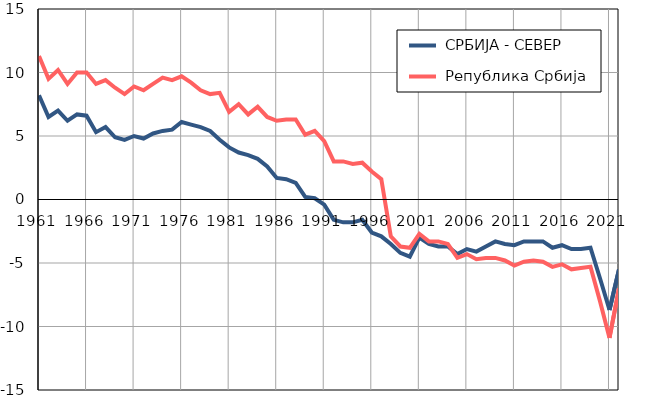
| Category |  СРБИЈА - СЕВЕР |  Република Србија |
|---|---|---|
| 1961.0 | 8.2 | 11.3 |
| 1962.0 | 6.5 | 9.5 |
| 1963.0 | 7 | 10.2 |
| 1964.0 | 6.2 | 9.1 |
| 1965.0 | 6.7 | 10 |
| 1966.0 | 6.6 | 10 |
| 1967.0 | 5.3 | 9.1 |
| 1968.0 | 5.7 | 9.4 |
| 1969.0 | 4.9 | 8.8 |
| 1970.0 | 4.7 | 8.3 |
| 1971.0 | 5 | 8.9 |
| 1972.0 | 4.8 | 8.6 |
| 1973.0 | 5.2 | 9.1 |
| 1974.0 | 5.4 | 9.6 |
| 1975.0 | 5.5 | 9.4 |
| 1976.0 | 6.1 | 9.7 |
| 1977.0 | 5.9 | 9.2 |
| 1978.0 | 5.7 | 8.6 |
| 1979.0 | 5.4 | 8.3 |
| 1980.0 | 4.7 | 8.4 |
| 1981.0 | 4.1 | 6.9 |
| 1982.0 | 3.7 | 7.5 |
| 1983.0 | 3.5 | 6.7 |
| 1984.0 | 3.2 | 7.3 |
| 1985.0 | 2.6 | 6.5 |
| 1986.0 | 1.7 | 6.2 |
| 1987.0 | 1.6 | 6.3 |
| 1988.0 | 1.3 | 6.3 |
| 1989.0 | 0.2 | 5.1 |
| 1990.0 | 0.1 | 5.4 |
| 1991.0 | -0.4 | 4.6 |
| 1992.0 | -1.6 | 3 |
| 1993.0 | -1.8 | 3 |
| 1994.0 | -1.8 | 2.8 |
| 1995.0 | -1.6 | 2.9 |
| 1996.0 | -2.6 | 2.2 |
| 1997.0 | -2.9 | 1.6 |
| 1998.0 | -3.5 | -2.9 |
| 1999.0 | -4.2 | -3.7 |
| 2000.0 | -4.5 | -3.8 |
| 2001.0 | -3 | -2.7 |
| 2002.0 | -3.5 | -3.3 |
| 2003.0 | -3.7 | -3.3 |
| 2004.0 | -3.7 | -3.5 |
| 2005.0 | -4.3 | -4.6 |
| 2006.0 | -3.9 | -4.3 |
| 2007.0 | -4.1 | -4.7 |
| 2008.0 | -3.7 | -4.6 |
| 2009.0 | -3.3 | -4.6 |
| 2010.0 | -3.5 | -4.8 |
| 2011.0 | -3.6 | -5.2 |
| 2012.0 | -3.3 | -4.9 |
| 2013.0 | -3.3 | -4.8 |
| 2014.0 | -3.3 | -4.9 |
| 2015.0 | -3.8 | -5.3 |
| 2016.0 | -3.6 | -5.1 |
| 2017.0 | -3.9 | -5.5 |
| 2018.0 | -3.9 | -5.4 |
| 2019.0 | -3.8 | -5.3 |
| 2020.0 | -6.2 | -8 |
| 2021.0 | -8.7 | -10.9 |
| 2022.0 | -5.5 | -7 |